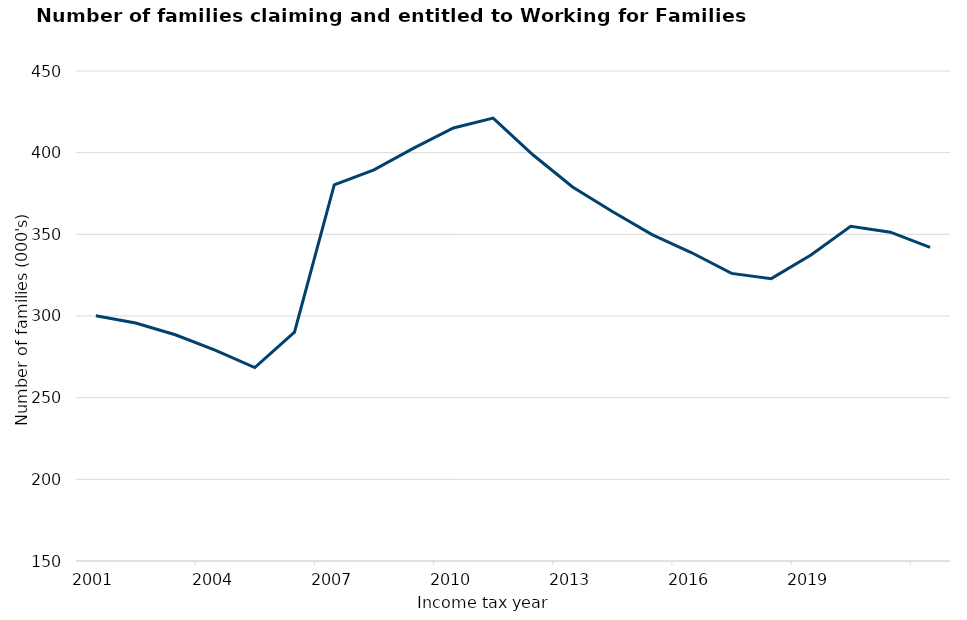
| Category | Series 0 |
|---|---|
| 2001-03-01 | 300.1 |
| 2002-03-01 | 295.7 |
| 2003-03-01 | 288.5 |
| 2004-03-01 | 279.1 |
| 2005-03-01 | 268.4 |
| 2006-03-01 | 290.1 |
| 2007-03-01 | 380.3 |
| 2008-03-01 | 389.5 |
| 2009-03-01 | 402.8 |
| 2010-03-01 | 415.1 |
| 2011-03-01 | 421.2 |
| 2012-03-01 | 398.7 |
| 2013-03-01 | 379 |
| 2014-03-01 | 364 |
| 2015-03-01 | 349.8 |
| 2016-03-01 | 338.7 |
| 2017-03-01 | 326.1 |
| 2018-03-01 | 322.888 |
| 2019-03-01 | 337.4 |
| 2020-03-01 | 354.9 |
| 2021-03-01 | 351.3 |
| 2022-03-01 | 342 |